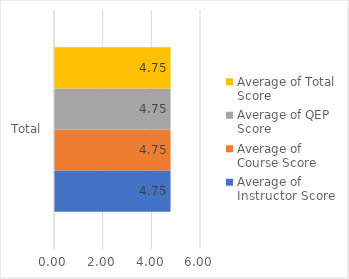
| Category | Average of Instructor Score | Average of Course Score | Average of QEP Score | Average of Total Score |
|---|---|---|---|---|
| Total | 4.75 | 4.75 | 4.75 | 4.75 |